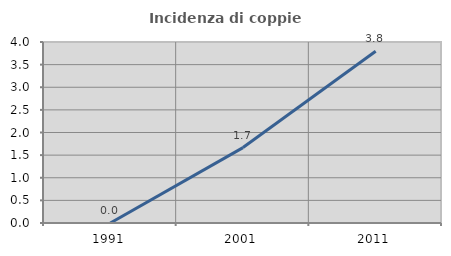
| Category | Incidenza di coppie miste |
|---|---|
| 1991.0 | 0 |
| 2001.0 | 1.667 |
| 2011.0 | 3.797 |